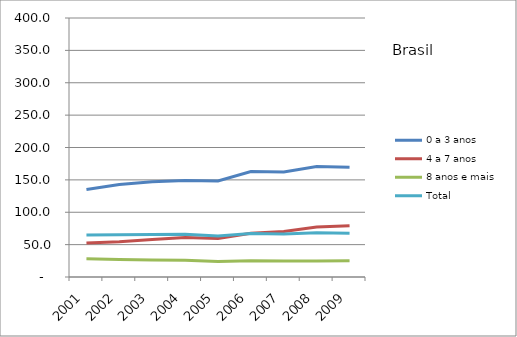
| Category | 0 a 3 anos | 4 a 7 anos | 8 anos e mais | Total |
|---|---|---|---|---|
| 2001.0 | 135.3 | 52.4 | 28 | 64.9 |
| 2002.0 | 142.7 | 54.3 | 26.9 | 65.4 |
| 2003.0 | 147.2 | 58 | 26.1 | 65.5 |
| 2004.0 | 149.2 | 60.9 | 25.9 | 65.9 |
| 2005.0 | 148.3 | 59.6 | 24.1 | 63.2 |
| 2006.0 | 162.8 | 67.4 | 25.2 | 67.3 |
| 2007.0 | 162.3 | 70.4 | 24.7 | 66.4 |
| 2008.0 | 170.5 | 77.1 | 24.7 | 68.2 |
| 2009.0 | 169.4 | 79 | 25 | 67.6 |